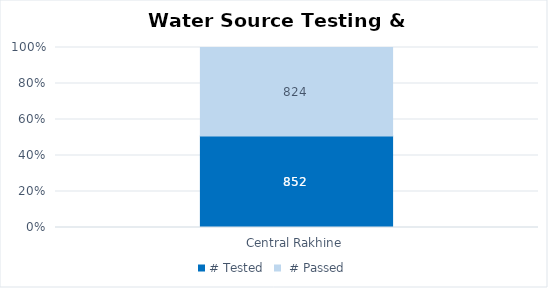
| Category | # Tested |  # Passed |
|---|---|---|
| Central Rakhine | 852 | 824 |